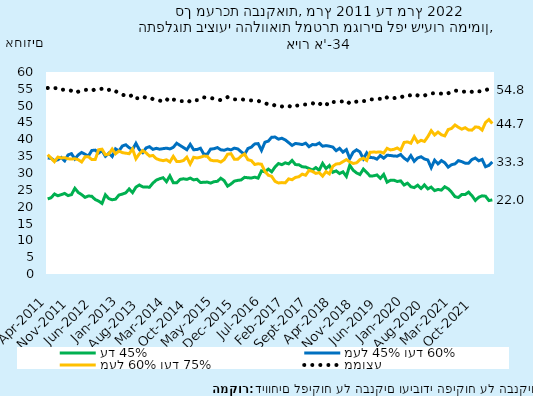
| Category | עד 45% | מעל 45% ועד 60% | מעל 60% ועד 75% | ממוצע |
|---|---|---|---|---|
| 2011-04-01 | 22.31 | 34.448 | 35.405 | 55.261 |
| 2011-05-01 | 22.647 | 34.385 | 34.396 | 55.509 |
| 2011-06-01 | 23.771 | 33.654 | 33.371 | 55.192 |
| 2011-07-01 | 23.235 | 33.946 | 34.726 | 55.252 |
| 2011-08-01 | 23.572 | 34.616 | 34.468 | 54.677 |
| 2011-09-01 | 23.937 | 33.622 | 34.542 | 54.814 |
| 2011-10-01 | 23.287 | 35.363 | 34.221 | 54.645 |
| 2011-11-01 | 23.569 | 35.745 | 34.145 | 54.432 |
| 2011-12-01 | 25.448 | 34.163 | 34.239 | 53.812 |
| 2012-01-01 | 24.229 | 35.382 | 33.955 | 54.163 |
| 2012-02-01 | 23.58 | 36.102 | 33.272 | 54.339 |
| 2012-03-01 | 22.758 | 35.565 | 34.799 | 54.667 |
| 2012-04-01 | 23.177 | 35.056 | 34.85 | 54.761 |
| 2012-05-01 | 23.079 | 36.692 | 33.984 | 54.438 |
| 2012-06-01 | 22.117 | 36.794 | 33.998 | 54.883 |
| 2012-07-01 | 21.663 | 35.916 | 36.922 | 54.85 |
| 2012-08-01 | 20.956 | 36.66 | 37.074 | 55.012 |
| 2012-09-01 | 23.53 | 34.964 | 35.402 | 54.457 |
| 2012-10-01 | 22.399 | 35.885 | 35.624 | 54.675 |
| 2012-11-01 | 22.052 | 34.889 | 37.116 | 54.901 |
| 2012-12-01 | 22.234 | 37.167 | 35.704 | 54.296 |
| 2013-01-01 | 23.457 | 36.54 | 36.534 | 53.73 |
| 2013-02-01 | 23.739 | 38.022 | 36.053 | 53.246 |
| 2013-03-01 | 24.106 | 38.382 | 35.888 | 52.987 |
| 2013-04-01 | 25.258 | 37.522 | 35.727 | 52.633 |
| 2013-05-01 | 24.172 | 36.972 | 37.14 | 53.237 |
| 2013-06-01 | 25.805 | 38.802 | 34.216 | 52.207 |
| 2013-07-01 | 26.432 | 36.933 | 35.711 | 52.22 |
| 2013-08-01 | 25.879 | 36.058 | 36.653 | 52.718 |
| 2013-09-01 | 25.844 | 37.451 | 35.986 | 52.334 |
| 2013-10-01 | 25.777 | 37.817 | 35.026 | 52.448 |
| 2013-11-01 | 26.999 | 37.022 | 35.212 | 51.943 |
| 2013-12-01 | 27.882 | 37.327 | 34.26 | 51.68 |
| 2014-01-01 | 28.304 | 37.07 | 33.882 | 51.508 |
| 2014-02-01 | 28.595 | 37.235 | 33.667 | 51.261 |
| 2014-03-01 | 27.42 | 37.383 | 33.911 | 51.976 |
| 2014-04-01 | 29.15 | 37.15 | 33.276 | 51.192 |
| 2014-05-01 | 27.127 | 37.617 | 34.938 | 51.805 |
| 2014-06-01 | 27.084 | 38.831 | 33.429 | 51.689 |
| 2014-07-01 | 28.104 | 38.19 | 33.434 | 51.349 |
| 2014-08-01 | 28.281 | 37.557 | 33.7 | 51.359 |
| 2014-09-01 | 28.102 | 36.91 | 34.698 | 51.679 |
| 2014-10-01 | 28.493 | 38.508 | 32.664 | 51.171 |
| 2014-11-01 | 27.956 | 36.921 | 34.662 | 51.684 |
| 2014-12-01 | 28.134 | 36.969 | 34.464 | 51.631 |
| 2015-01-01 | 27.175 | 37.359 | 34.691 | 51.944 |
| 2015-02-01 | 27.242 | 35.583 | 35.03 | 52.467 |
| 2015-03-01 | 27.305 | 35.539 | 34.973 | 52.367 |
| 2015-04-01 | 27.007 | 37.098 | 33.825 | 52.285 |
| 2015-05-01 | 27.413 | 37.208 | 33.608 | 52.074 |
| 2015-06-01 | 27.525 | 37.55 | 33.647 | 51.906 |
| 2015-07-01 | 28.443 | 36.887 | 33.258 | 51.619 |
| 2015-08-01 | 27.718 | 36.759 | 33.976 | 52.101 |
| 2015-09-01 | 26.093 | 37.12 | 35.564 | 52.54 |
| 2015-10-01 | 26.733 | 36.863 | 35.731 | 52.34 |
| 2015-11-01 | 27.588 | 37.375 | 34.078 | 51.87 |
| 2015-12-01 | 27.811 | 37.162 | 34.061 | 51.874 |
| 2016-01-01 | 27.947 | 36.305 | 35.038 | 51.941 |
| 2016-02-01 | 28.711 | 35.515 | 35.635 | 51.733 |
| 2016-03-01 | 28.584 | 37.276 | 33.939 | 51.629 |
| 2016-04-01 | 28.508 | 37.681 | 33.684 | 51.558 |
| 2016-05-01 | 28.762 | 38.631 | 32.529 | 51.422 |
| 2016-06-01 | 28.471 | 38.732 | 32.737 | 51.446 |
| 2016-07-01 | 30.636 | 36.731 | 32.594 | 51.008 |
| 2016-08-01 | 30.341 | 39.126 | 30.5 | 50.733 |
| 2016-09-01 | 31.155 | 39.463 | 29.333 | 50.426 |
| 2016-10-01 | 30.356 | 40.637 | 28.996 | 50.527 |
| 2016-11-01 | 31.808 | 40.666 | 27.512 | 50.009 |
| 2016-12-01 | 32.809 | 40.051 | 27.036 | 49.689 |
| 2017-01-01 | 32.48 | 40.335 | 27.149 | 49.774 |
| 2017-02-01 | 33.026 | 39.833 | 27.076 | 49.615 |
| 2017-03-01 | 32.715 | 39.027 | 28.253 | 49.931 |
| 2017-04-01 | 33.745 | 38.184 | 28.005 | 49.549 |
| 2017-05-01 | 32.495 | 38.771 | 28.695 | 50.032 |
| 2017-06-01 | 32.461 | 38.637 | 28.889 | 50.022 |
| 2017-07-01 | 31.839 | 38.448 | 29.666 | 50.344 |
| 2017-08-01 | 31.775 | 38.856 | 29.325 | 50.341 |
| 2017-09-01 | 31.318 | 37.81 | 30.776 | 50.569 |
| 2017-10-01 | 30.877 | 38.46 | 30.469 | 50.756 |
| 2017-11-01 | 31.605 | 38.363 | 29.884 | 50.309 |
| 2017-12-01 | 30.806 | 38.903 | 30.115 | 50.731 |
| 2018-01-01 | 32.862 | 37.954 | 29.076 | 49.97 |
| 2018-02-01 | 31.315 | 38.136 | 30.419 | 50.554 |
| 2018-03-01 | 32.205 | 37.962 | 29.74 | 50.204 |
| 2018-04-01 | 30.213 | 37.705 | 31.972 | 51.097 |
| 2018-05-01 | 30.625 | 36.631 | 32.679 | 51.058 |
| 2018-06-01 | 29.825 | 37.334 | 32.772 | 51.242 |
| 2018-07-01 | 30.342 | 36.196 | 33.365 | 51.252 |
| 2018-08-01 | 28.985 | 36.949 | 33.979 | 51.532 |
| 2018-09-01 | 32.29 | 34.296 | 33.296 | 50.624 |
| 2018-10-01 | 30.837 | 36.171 | 32.835 | 50.949 |
| 2018-11-01 | 30.021 | 36.881 | 33.024 | 51.215 |
| 2018-12-01 | 29.546 | 36.262 | 33.984 | 51.538 |
| 2019-01-01 | 31.14 | 34.208 | 34.408 | 51.354 |
| 2019-02-01 | 30.127 | 35.983 | 33.705 | 51.412 |
| 2019-03-01 | 29.104 | 34.588 | 36.182 | 51.856 |
| 2019-04-01 | 29.155 | 34.549 | 36.208 | 51.862 |
| 2019-05-01 | 29.416 | 34.111 | 36.193 | 51.951 |
| 2019-06-01 | 28.4 | 35.186 | 36.268 | 52.035 |
| 2019-07-01 | 29.583 | 34.394 | 35.911 | 51.689 |
| 2019-08-01 | 27.274 | 35.267 | 37.328 | 52.5 |
| 2019-09-01 | 27.839 | 35.206 | 36.847 | 52.17 |
| 2019-10-01 | 27.871 | 35.037 | 37.029 | 52.21 |
| 2019-11-01 | 27.472 | 35 | 37.433 | 52.428 |
| 2019-12-01 | 27.668 | 35.488 | 36.773 | 52.356 |
| 2020-01-01 | 26.428 | 34.428 | 39.081 | 52.98 |
| 2020-02-01 | 26.969 | 33.697 | 39.231 | 52.937 |
| 2020-03-01 | 25.92 | 35.163 | 38.85 | 53.115 |
| 2020-04-01 | 25.669 | 33.47 | 40.797 | 53.452 |
| 2020-05-01 | 26.373 | 34.463 | 39.1 | 53.044 |
| 2020-06-01 | 25.417 | 34.83 | 39.705 | 53.245 |
| 2020-07-01 | 26.455 | 34.156 | 39.366 | 52.973 |
| 2020-08-01 | 25.285 | 33.868 | 40.792 | 53.456 |
| 2020-09-01 | 25.813 | 31.579 | 42.573 | 53.663 |
| 2020-10-01 | 24.777 | 33.794 | 41.299 | 53.669 |
| 2020-11-01 | 25.116 | 32.709 | 42.152 | 53.663 |
| 2020-12-01 | 24.922 | 33.698 | 41.359 | 53.573 |
| 2021-01-01 | 25.9 | 33.037 | 41.023 | 53.284 |
| 2021-02-01 | 25.323 | 31.747 | 42.91 | 53.694 |
| 2021-03-01 | 24.298 | 32.468 | 43.231 | 54.021 |
| 2021-04-01 | 22.979 | 32.704 | 44.277 | 54.498 |
| 2021-05-01 | 22.726 | 33.677 | 43.584 | 54.352 |
| 2021-06-01 | 23.603 | 33.373 | 43.017 | 54.116 |
| 2021-07-01 | 23.595 | 32.928 | 43.457 | 54.187 |
| 2021-08-01 | 24.321 | 32.896 | 42.776 | 53.87 |
| 2021-09-01 | 23.267 | 33.998 | 42.73 | 54.13 |
| 2021-10-01 | 21.864 | 34.439 | 43.687 | 54.532 |
| 2021-11-01 | 22.8 | 33.623 | 43.572 | 54.278 |
| 2021-12-01 | 23.218 | 34.033 | 42.743 | 54.147 |
| 2022-01-01 | 23.115 | 31.866 | 45.005 | 54.562 |
| 2022-02-01 | 21.81 | 32.273 | 45.883 | 55.012 |
| 2022-03-01 | 22.021 | 33.262 | 44.691 | 54.755 |